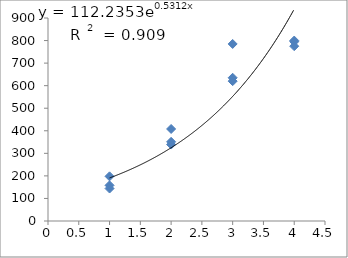
| Category | Series 0 |
|---|---|
| 1.0 | 158 |
| 1.0 | 144 |
| 1.0 | 198 |
| 2.0 | 408 |
| 2.0 | 339 |
| 2.0 | 351 |
| 3.0 | 620 |
| 3.0 | 785 |
| 3.0 | 635 |
| 4.0 | 775 |
| 4.0 | 800 |
| 4.0 | 795 |